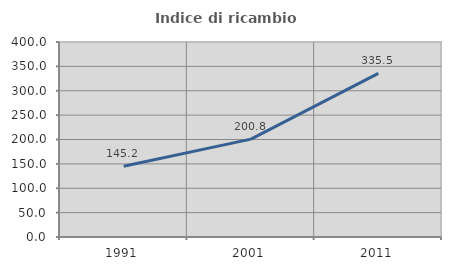
| Category | Indice di ricambio occupazionale  |
|---|---|
| 1991.0 | 145.174 |
| 2001.0 | 200.837 |
| 2011.0 | 335.514 |